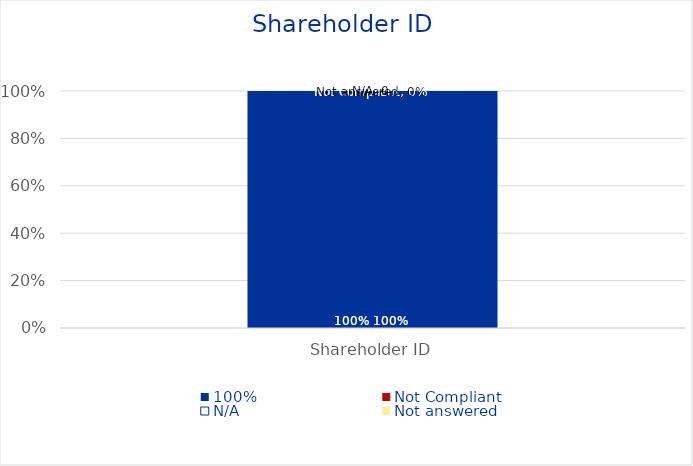
| Category | 100% | Not Compliant | N/A | Not answered |
|---|---|---|---|---|
| Shareholder ID | 1 | 0 | 0 | 0 |